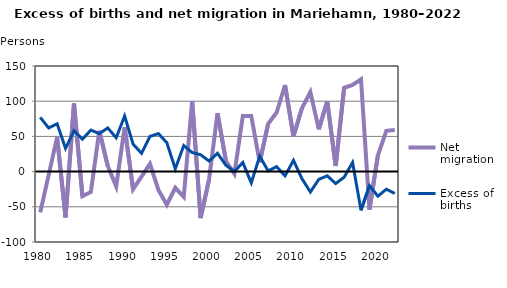
| Category | Net migration | Excess of births |
|---|---|---|
| 1980.0 | -58 | 77 |
| 1981.0 | -5 | 62 |
| 1982.0 | 49 | 68 |
| 1983.0 | -65 | 33 |
| 1984.0 | 97 | 58 |
| 1985.0 | -35 | 46 |
| 1986.0 | -29 | 59 |
| 1987.0 | 58 | 54 |
| 1988.0 | 8 | 62 |
| 1989.0 | -21 | 48 |
| 1990.0 | 63 | 79 |
| 1991.0 | -25 | 39 |
| 1992.0 | -7 | 26 |
| 1993.0 | 11 | 50 |
| 1994.0 | -26 | 54 |
| 1995.0 | -47 | 41 |
| 1996.0 | -23 | 4 |
| 1997.0 | -36 | 37 |
| 1998.0 | 100 | 27 |
| 1999.0 | -66 | 24 |
| 2000.0 | -11 | 15 |
| 2001.0 | 83 | 26 |
| 2002.0 | 15 | 9 |
| 2003.0 | -3 | 0 |
| 2004.0 | 79 | 13 |
| 2005.0 | 79 | -16 |
| 2006.0 | 13 | 22 |
| 2007.0 | 68 | 1 |
| 2008.0 | 84 | 7 |
| 2009.0 | 123 | -6 |
| 2010.0 | 50 | 16 |
| 2011.0 | 90 | -10 |
| 2012.0 | 113 | -29 |
| 2013.0 | 60 | -11 |
| 2014.0 | 100 | -6 |
| 2015.0 | 8 | -17 |
| 2016.0 | 119 | -8 |
| 2017.0 | 123 | 13 |
| 2018.0 | 131 | -55 |
| 2019.0 | -54 | -20 |
| 2020.0 | 23 | -35 |
| 2021.0 | 58 | -25 |
| 2022.0 | 59 | -31 |